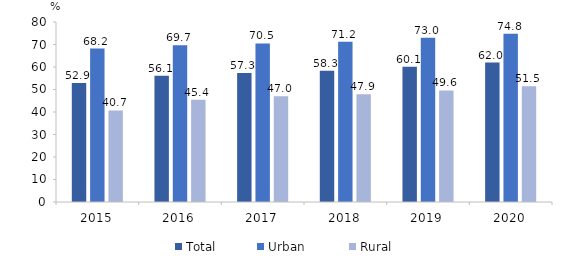
| Category | Total | Urban  | Rural |
|---|---|---|---|
| 2015.0 | 52.9 | 68.2 | 40.7 |
| 2016.0 | 56.1 | 69.7 | 45.4 |
| 2017.0 | 57.3 | 70.5 | 47 |
| 2018.0 | 58.3 | 71.2 | 47.9 |
| 2019.0 | 60.1 | 73 | 49.6 |
| 2020.0 | 62 | 74.8 | 51.5 |